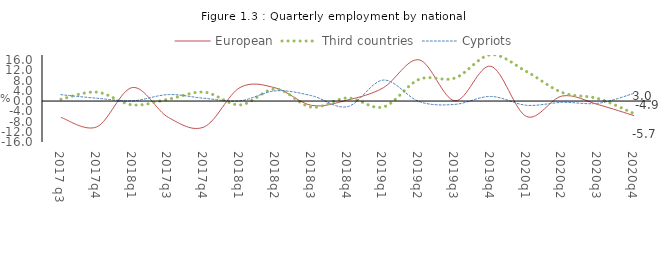
| Category | European | Third countries |
|---|---|---|
| 2017 q3 | -6.4 | 0.7 |
| 2017q4 | -10.1 | 3.5 |
| 2018q1 | 5.3 | -1.5 |
| 2017q3 | -6.394 | 0.718 |
| 2017q4 | -10.103 | 3.476 |
| 2018q1 | 5.3 | -1.5 |
| 2018q2 | 5.1 | 4.7 |
| 2018q3 | -1.7 | -2.4 |
| 2018q4 | 0.4 | 1.2 |
| 2019q1 | 5.2 | -2.3 |
| 2019q2 | 16.1 | 8.5 |
| 2019q3 | 0.1 | 9 |
| 2019q4 | 13.6 | 18.1 |
| 2020q1 | -6.054 | 11.501 |
| 2020q2 | 2 | 3.3 |
| 2020q3 | -1.397 | 0.948 |
| 2020q4 | -5.7 | -4.9 |